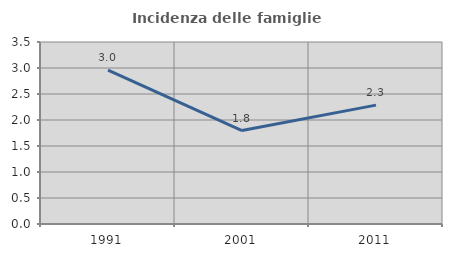
| Category | Incidenza delle famiglie numerose |
|---|---|
| 1991.0 | 2.959 |
| 2001.0 | 1.796 |
| 2011.0 | 2.286 |